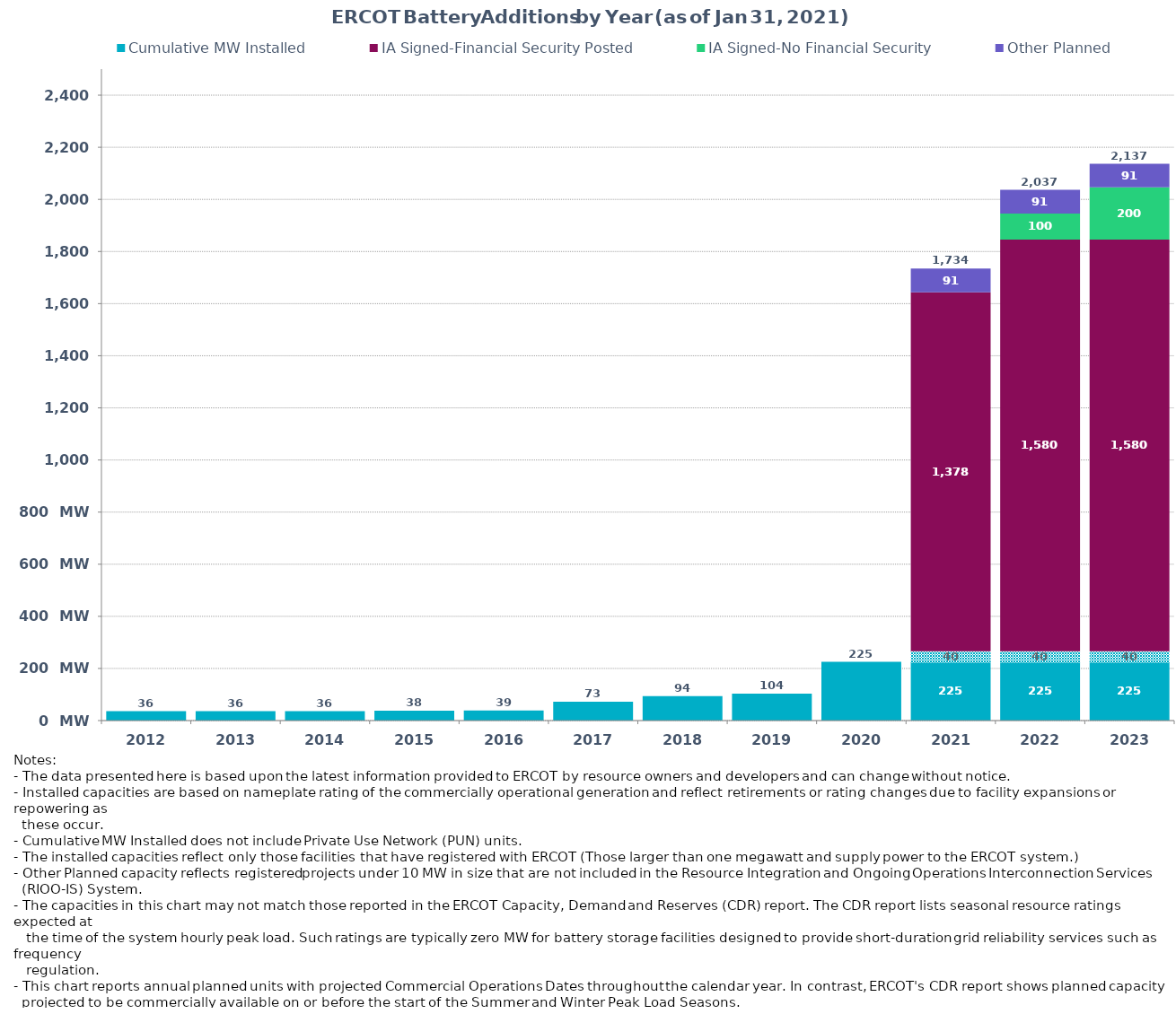
| Category | Cumulative MW Installed | Cumulative MW Synchronized | IA Signed-Financial Security Posted  | IA Signed-No Financial Security  | Other Planned | Cumulative Installed and Planned |
|---|---|---|---|---|---|---|
| 2012.0 | 36 | 0 | 0 | 0 | 0 | 36 |
| 2013.0 | 36 | 0 | 0 | 0 | 0 | 36 |
| 2014.0 | 36 | 0 | 0 | 0 | 0 | 36 |
| 2015.0 | 38 | 0 | 0 | 0 | 0 | 38 |
| 2016.0 | 39 | 0 | 0 | 0 | 0 | 39 |
| 2017.0 | 72.5 | 0 | 0 | 0 | 0 | 72.5 |
| 2018.0 | 93.8 | 0 | 0 | 0 | 0 | 93.8 |
| 2019.0 | 103.7 | 0 | 0 | 0 | 0 | 103.7 |
| 2020.0 | 225.4 | 0 | 0 | 0 | 0 | 225.4 |
| 2021.0 | 225.4 | 40.26 | 1377.88 | 0 | 90.73 | 1734.27 |
| 2022.0 | 225.4 | 40.26 | 1580.29 | 100 | 90.73 | 2036.68 |
| 2023.0 | 225.4 | 40.26 | 1580.29 | 200 | 90.73 | 2136.68 |